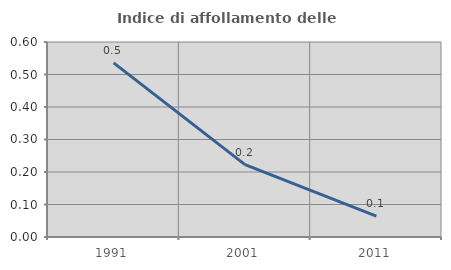
| Category | Indice di affollamento delle abitazioni  |
|---|---|
| 1991.0 | 0.536 |
| 2001.0 | 0.223 |
| 2011.0 | 0.064 |